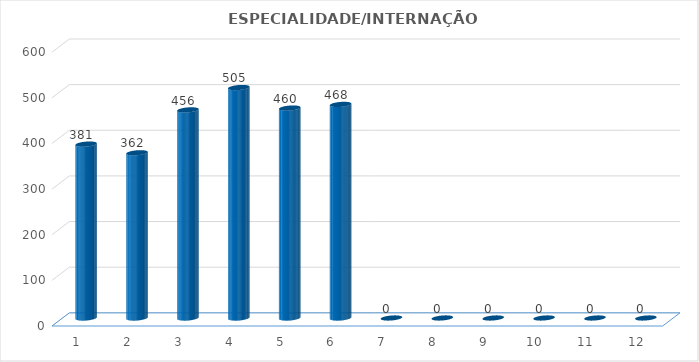
| Category | Series 0 |
|---|---|
| 0 | 381 |
| 1 | 362 |
| 2 | 456 |
| 3 | 505 |
| 4 | 460 |
| 5 | 468 |
| 6 | 0 |
| 7 | 0 |
| 8 | 0 |
| 9 | 0 |
| 10 | 0 |
| 11 | 0 |